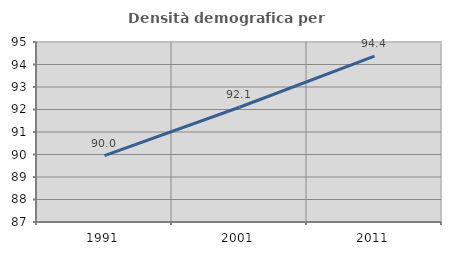
| Category | Densità demografica |
|---|---|
| 1991.0 | 89.951 |
| 2001.0 | 92.101 |
| 2011.0 | 94.374 |